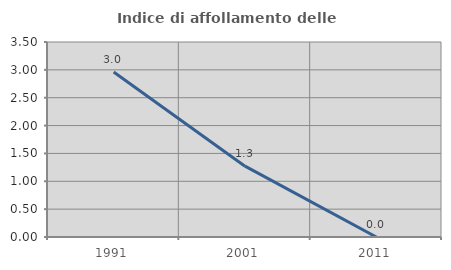
| Category | Indice di affollamento delle abitazioni  |
|---|---|
| 1991.0 | 2.963 |
| 2001.0 | 1.271 |
| 2011.0 | 0 |